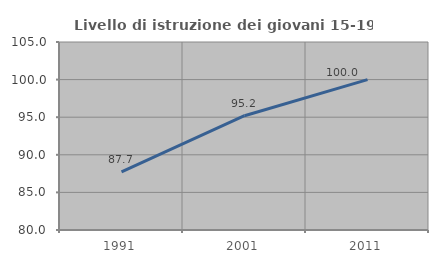
| Category | Livello di istruzione dei giovani 15-19 anni |
|---|---|
| 1991.0 | 87.719 |
| 2001.0 | 95.2 |
| 2011.0 | 100 |